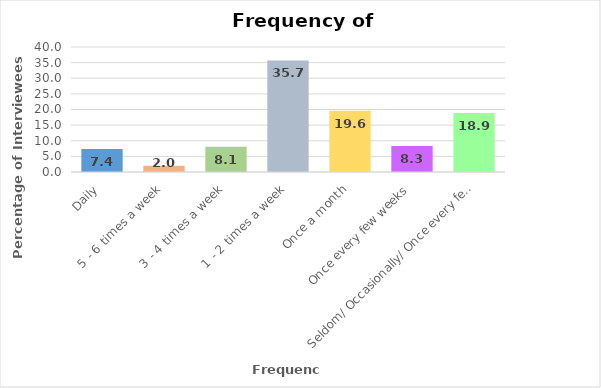
| Category | Series 0 |
|---|---|
| Daily | 7.4 |
| 5 - 6 times a week | 2 |
| 3 - 4 times a week | 8.1 |
| 1 - 2 times a week | 35.7 |
| Once a month | 19.6 |
| Once every few weeks | 8.3 |
| Seldom/ Occasionally/ Once every few mths | 18.9 |